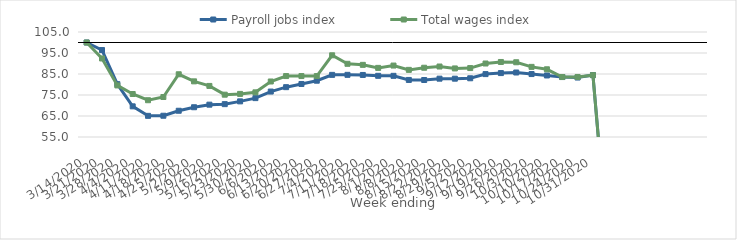
| Category | Payroll jobs index | Total wages index |
|---|---|---|
| 14/03/2020 | 100 | 100 |
| 21/03/2020 | 96.408 | 92.4 |
| 28/03/2020 | 80.169 | 79.556 |
| 04/04/2020 | 69.6 | 75.474 |
| 11/04/2020 | 65.067 | 72.513 |
| 18/04/2020 | 65.125 | 74.042 |
| 25/04/2020 | 67.5 | 84.871 |
| 02/05/2020 | 69.172 | 81.496 |
| 09/05/2020 | 70.396 | 79.32 |
| 16/05/2020 | 70.644 | 75.154 |
| 23/05/2020 | 71.97 | 75.528 |
| 30/05/2020 | 73.518 | 76.263 |
| 06/06/2020 | 76.64 | 81.436 |
| 13/06/2020 | 78.729 | 84.02 |
| 20/06/2020 | 80.252 | 84.021 |
| 27/06/2020 | 81.806 | 84.019 |
| 04/07/2020 | 84.586 | 93.908 |
| 11/07/2020 | 84.6 | 89.854 |
| 18/07/2020 | 84.545 | 89.359 |
| 25/07/2020 | 84.136 | 87.914 |
| 01/08/2020 | 84.128 | 89.024 |
| 08/08/2020 | 82.173 | 86.969 |
| 15/08/2020 | 82.143 | 87.979 |
| 22/08/2020 | 82.776 | 88.562 |
| 29/08/2020 | 82.773 | 87.649 |
| 05/09/2020 | 82.966 | 87.821 |
| 12/09/2020 | 84.949 | 89.994 |
| 19/09/2020 | 85.439 | 90.725 |
| 26/09/2020 | 85.707 | 90.59 |
| 03/10/2020 | 84.975 | 88.399 |
| 10/10/2020 | 84.299 | 87.243 |
| 17/10/2020 | 83.552 | 83.562 |
| 24/10/2020 | 83.315 | 83.58 |
| 31/10/2020 | 84.491 | 84.455 |